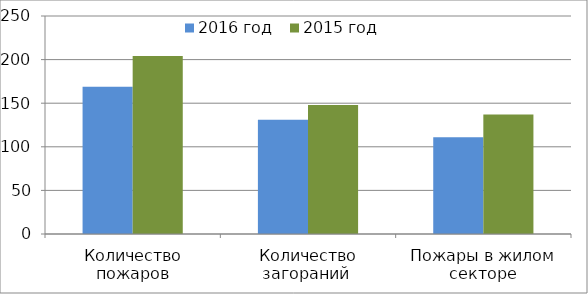
| Category | 2016 год | 2015 год |
|---|---|---|
| Количество пожаров | 169 | 204 |
| Количество загораний  | 131 | 148 |
| Пожары в жилом секторе | 111 | 137 |